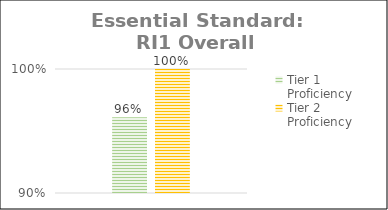
| Category | Tier 1 Proficiency | Tier 2 Proficiency |
|---|---|---|
| 0 | 0.961 | 1 |